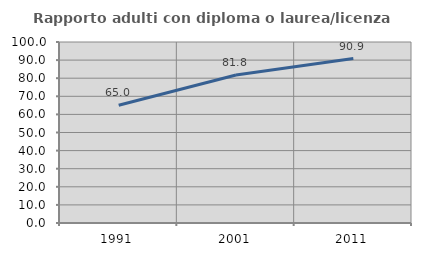
| Category | Rapporto adulti con diploma o laurea/licenza media  |
|---|---|
| 1991.0 | 65.031 |
| 2001.0 | 81.778 |
| 2011.0 | 90.857 |